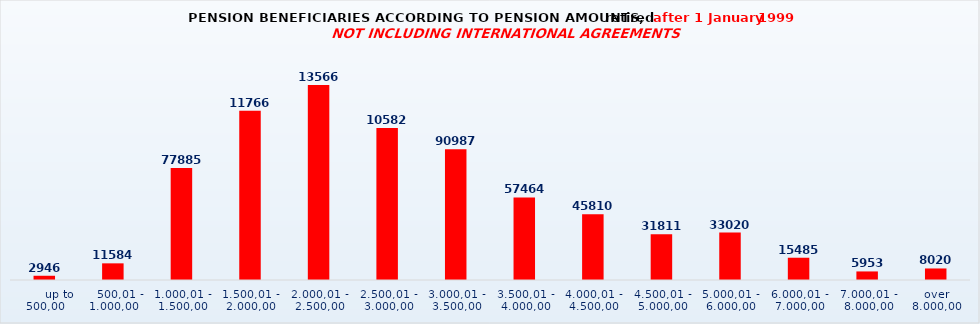
| Category | Series 0 |
|---|---|
|       up to 500,00 | 2946 |
|    500,01 - 1.000,00 | 11584 |
| 1.000,01 - 1.500,00 | 77885 |
| 1.500,01 - 2.000,00 | 117663 |
| 2.000,01 - 2.500,00 | 135662 |
| 2.500,01 - 3.000,00 | 105825 |
| 3.000,01 - 3.500,00 | 90987 |
| 3.500,01 - 4.000,00 | 57464 |
| 4.000,01 - 4.500,00 | 45810 |
| 4.500,01 - 5.000,00 | 31811 |
| 5.000,01 - 6.000,00 | 33020 |
| 6.000,01 - 7.000,00 | 15485 |
| 7.000,01 - 8.000,00 | 5953 |
| over 8.000,00 | 8020 |